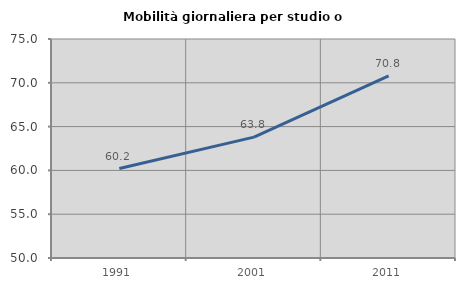
| Category | Mobilità giornaliera per studio o lavoro |
|---|---|
| 1991.0 | 60.209 |
| 2001.0 | 63.801 |
| 2011.0 | 70.78 |